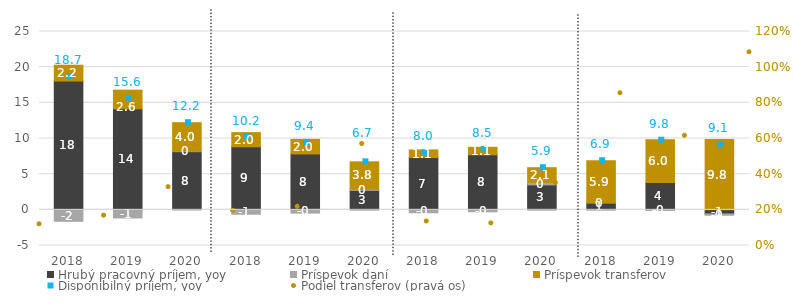
| Category | Hrubý pracovný príjem, yoy | Príspevok daní | Príspevok transferov |
|---|---|---|---|
| 2018.0 | 18.049 | -1.609 | 2.219 |
| 2019.0 | 14.161 | -1.137 | 2.618 |
| 2020.0 | 8.153 | 0.068 | 3.995 |
| 2018.0 | 8.84 | -0.62 | 1.987 |
| 2019.0 | 7.834 | -0.459 | 2.046 |
| 2020.0 | 2.728 | 0.172 | 3.831 |
| 2018.0 | 7.326 | -0.408 | 1.078 |
| 2019.0 | 7.714 | -0.28 | 1.052 |
| 2020.0 | 3.498 | 0.341 | 2.067 |
| 2018.0 | 0.961 | 0.044 | 5.873 |
| 2019.0 | 3.836 | -0.084 | 6.004 |
| 2020.0 | -0.573 | -0.187 | 9.85 |